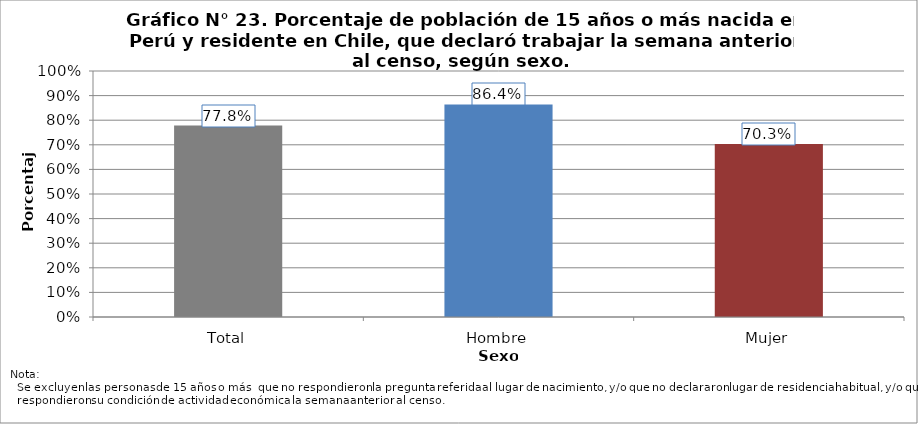
| Category | Población que declara trabajar  |
|---|---|
| Total | 0.778 |
| Hombre | 0.864 |
| Mujer | 0.703 |